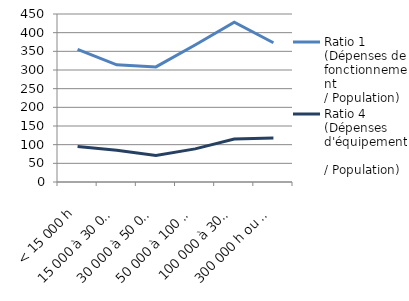
| Category | Ratio 1 
(Dépenses de fonctionnement 
/ Population) | Ratio 4 
(Dépenses d'équipement 
/ Population) |
|---|---|---|
| < 15 000 h | 355.08 | 95.402 |
| 15 000 à 30 000 h | 313.803 | 84.758 |
| 30 000 à 50 000 h | 308.233 | 70.789 |
| 50 000 à 100 000 h | 367.067 | 88.713 |
| 100 000 à 300 000 h | 427.923 | 115.285 |
| 300 000 h ou plus | 372.901 | 117.874 |